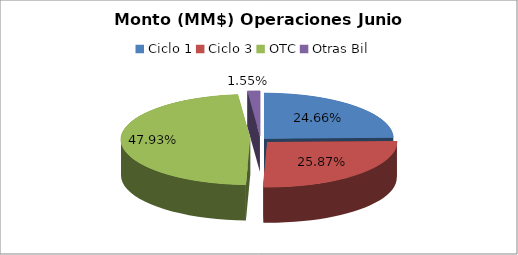
| Category | Series 0 |
|---|---|
| Ciclo 1 | 16777760.924 |
| Ciclo 3 | 17604169.829 |
| OTC | 32614242.011 |
| Otras Bil | 1051618.708 |